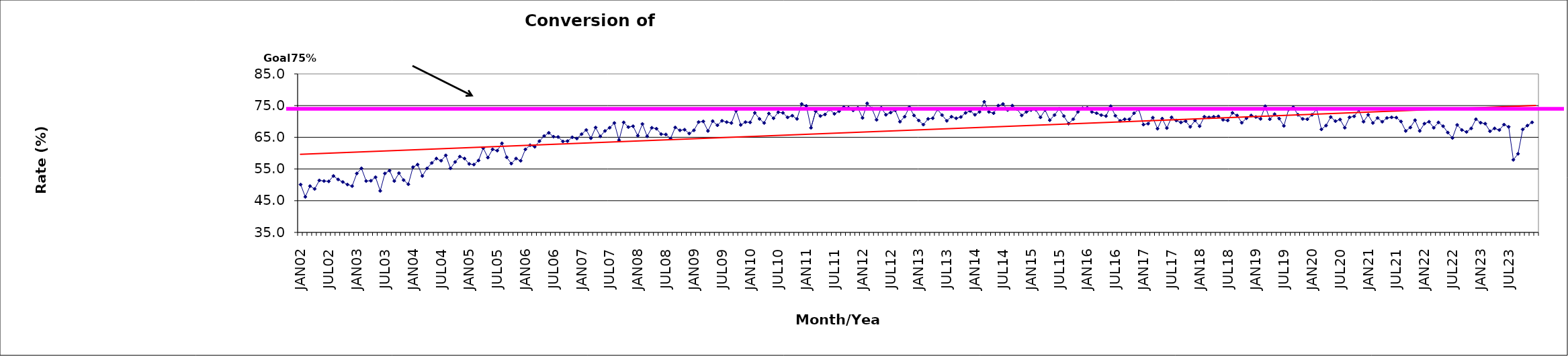
| Category | Series 0 |
|---|---|
| JAN02 | 50.1 |
| FEB02 | 46.2 |
| MAR02 | 49.6 |
| APR02 | 48.7 |
| MAY02 | 51.4 |
| JUN02 | 51.2 |
| JUL02 | 51.1 |
| AUG02 | 52.8 |
| SEP02 | 51.7 |
| OCT02 | 50.9 |
| NOV02 | 50.1 |
| DEC02 | 49.6 |
| JAN03 | 53.6 |
| FEB03 | 55.2 |
| MAR03 | 51.2 |
| APR03 | 51.3 |
| MAY03 | 52.4 |
| JUN03 | 48.1 |
| JUL03 | 53.6 |
| AUG03 | 54.5 |
| SEP03 | 51.2 |
| OCT03 | 53.7 |
| NOV03 | 51.5 |
| DEC03 | 50.2 |
| JAN04 | 55.6 |
| FEB04 | 56.4 |
| MAR04 | 52.8 |
| APR04 | 55.2 |
| MAY04 | 56.9 |
| JUN04 | 58.3 |
| JUL04 | 57.6 |
| AUG04 | 59.3 |
| SEP04 | 55.2 |
| OCT04 | 57.2 |
| NOV04 | 58.9 |
| DEC04 | 58.3 |
| JAN05 | 56.6 |
| FEB05 | 56.4 |
| MAR05 | 57.7 |
| APR05 | 61.6 |
| MAY05 | 58.6 |
| JUN05 | 61.2 |
| JUL05 | 60.8 |
| AUG05 | 63.1 |
| SEP05 | 58.7 |
| OCT05 | 56.7 |
| NOV05 | 58.3 |
| DEC05 | 57.6 |
| JAN06 | 61.2 |
| FEB06 | 62.5 |
| MAR06 | 62 |
| APR06 | 63.8 |
| MAY06 | 65.4 |
| JUN06 | 66.4 |
| JUL06 | 65.2 |
| AUG06 | 65.1 |
| SEP06 | 63.7 |
| OCT06 | 63.8 |
| NOV06 | 65 |
| DEC06 | 64.6 |
| JAN07 | 66 |
| FEB07 | 67.3 |
| MAR07 | 64.7 |
| APR07 | 68.1 |
| MAY07 | 65.3 |
| JUN07 | 67 |
| JUL07 | 68 |
| AUG07 | 69.5 |
| SEP07 | 64.1 |
| OCT07 | 69.7 |
| NOV07 | 68.2 |
| DEC07 | 68.5 |
| JAN08 | 65.5 |
| FEB08 | 69.2 |
| MAR08 | 65.3 |
| APR08 | 68 |
| MAY08 | 67.7 |
| JUN08 | 66 |
| JUL08 | 65.9 |
| AUG08 | 64.6 |
| SEP08 | 68.1 |
| OCT08 | 67.2 |
| NOV08 | 67.4 |
| DEC08 | 66.2 |
| JAN09 | 67.2 |
| FEB09 | 69.8 |
| MAR09 | 70 |
| APR09 | 67 |
| MAY09 | 70.1 |
| JUN09 | 68.8 |
| JUL09 | 70.2 |
| AUG09 | 69.8 |
| SEP09 | 69.5 |
| OCT09 | 73.4 |
| NOV09 | 68.9 |
| DEC09 | 69.8 |
| JAN10 | 69.7 |
| FEB10 | 72.7 |
| MAR10 | 70.8 |
| APR10 | 69.5 |
| MAY10 | 72.5 |
| JUN10 | 71 |
| JUL10 | 72.9 |
| AUG10 | 72.7 |
| SEP10 | 71.3 |
| OCT10 | 71.8 |
| NOV10 | 70.8 |
| DEC10 | 75.5 |
| JAN11 | 74.9 |
| FEB11 | 68 |
| MAR11 | 73.2 |
| APR11 | 71.7 |
| MAY11 | 72.2 |
| JUN11 | 73.8 |
| JUL11 | 72.4 |
| AUG11 | 73.2 |
| SEP11 | 74.5 |
| OCT11 | 74.3 |
| NOV11 | 73.5 |
| DEC11 | 74.3 |
| JAN12 | 71.1 |
| FEB12 | 75.7 |
| MAR12 | 74.1 |
| APR12 | 70.5 |
| MAY12 | 74.3 |
| JUN12 | 72.1 |
| JUL12 | 72.8 |
| AUG12 | 73.5 |
| SEP12 | 69.9 |
| OCT12 | 71.5 |
| NOV12 | 74.5 |
| DEC12 | 71.9 |
| JAN13 | 70.3 |
| FEB13 | 69 |
| MAR13 | 70.8 |
| APR13 | 71 |
| MAY13 | 73.8 |
| JUN13 | 72 |
| JUL13 | 70.2 |
| AUG13 | 71.5 |
| SEP13 | 71 |
| OCT13 | 71.4 |
| NOV13 | 72.7 |
| DEC13 | 73.3 |
| JAN14 | 72.1 |
| FEB14 | 73 |
| MAR14 | 76.2 |
| APR14 | 73 |
| MAY14 | 72.6 |
| JUN14 | 75 |
| JUL14 | 75.5 |
| AUG14 | 73.6 |
| SEP14 | 75 |
| OCT14 | 73.9 |
| NOV14 | 71.9 |
| DEC14 | 73 |
| JAN15 | 73.6 |
| FEB15 | 73.7 |
| MAR15 | 71.3 |
| APR15 | 73.6 |
| MAY15 | 70.4 |
| JUN15 | 72 |
| JUL15 | 74 |
| AUG15 | 71.7 |
| SEP15 | 69.3 |
| OCT15 | 70.7 |
| NOV15 | 73 |
| DEC15 | 74.2 |
| JAN16 | 74.3 |
| FEB16 | 73 |
| MAR16 | 72.6 |
| APR16 | 72 |
| MAY16 | 71.7 |
| JUN16 | 74.8 |
| JUL16 | 71.8 |
| AUG16 | 70.2 |
| SEP16 | 70.7 |
| OCT16 | 70.7 |
| NOV16 | 72.6 |
| DEC16 | 73.8 |
| JAN17 | 69 |
| FEB17 | 69.3 |
| MAR17 | 71.2 |
| APR17 | 67.7 |
| MAY17 | 70.9 |
| JUN17 | 67.9 |
| JUL17 | 71.3 |
| AUG17 | 70.3 |
| SEP17 | 69.7 |
| OCT17 | 70.1 |
| NOV17 | 68.3 |
| DEC17 | 70.3 |
| JAN18 | 68.5 |
| FEB18 | 71.5 |
| MAR18 | 71.3 |
| APR18 | 71.5 |
| MAY18 | 71.6 |
| JUN18 | 70.5 |
| JUL18 | 70.3 |
| AUG18 | 72.7 |
| SEP18 | 71.9 |
| OCT18 | 69.6 |
| NOV18 | 71 |
| DEC18 | 71.9 |
| JAN19 | 71.4 |
| FEB19 | 70.8 |
| MAR19 | 74.8 |
| APR19 | 70.7 |
| MAY19 | 72.3 |
| JUN19 | 70.9 |
| JUL19 | 68.6 |
| AUG19 | 73.8 |
| SEP19 | 74.5 |
| OCT19 | 72.1 |
| NOV19 | 70.8 |
| DEC19 | 70.7 |
| JAN20 | 72.1 |
| FEB20 | 73.9 |
| MAR20 | 67.5 |
| APR20 | 68.7 |
| MAY20 | 71.4 |
| JUN20 | 70.1 |
| JUL20 | 70.6 |
| AUG20 | 68 |
| SEP20 | 71.3 |
| OCT20 | 71.6 |
| NOV20 | 73.7 |
| DEC20 | 69.9 |
| JAN21 | 72.1 |
| FEB21 | 69.5 |
| MAR21 | 71.1 |
| APR21 | 69.9 |
| MAY21 | 71.1 |
| JUN21 | 71.3 |
| JUL21 | 71.2 |
| AUG21 | 70 |
| SEP21 | 67 |
| OCT21 | 68.1 |
| NOV21 | 70.4 |
| DEC21 | 67 |
| JAN22 | 69.3 |
| FEB22 | 69.9 |
| MAR22 | 68 |
| APR22 | 69.7 |
| MAY22 | 68.5 |
| JUN22 | 66.5 |
| JUL22 | 64.8 |
| AUG22 | 68.9 |
| SEP22 | 67.3 |
| OCT22 | 66.7 |
| NOV22 | 67.8 |
| DEC22 | 70.7 |
| JAN23 | 69.6 |
| FEB23 | 69.3 |
| MAR23 | 66.9 |
| APR23 | 67.8 |
| MAY23 | 67.3 |
| JUN23 | 69 |
| JUL23 | 68.3 |
| AUG23 | 57.9 |
| SEP23 | 59.8 |
| OCT23 | 67.5 |
| NOV23 | 68.7 |
| DEC23 | 69.7 |